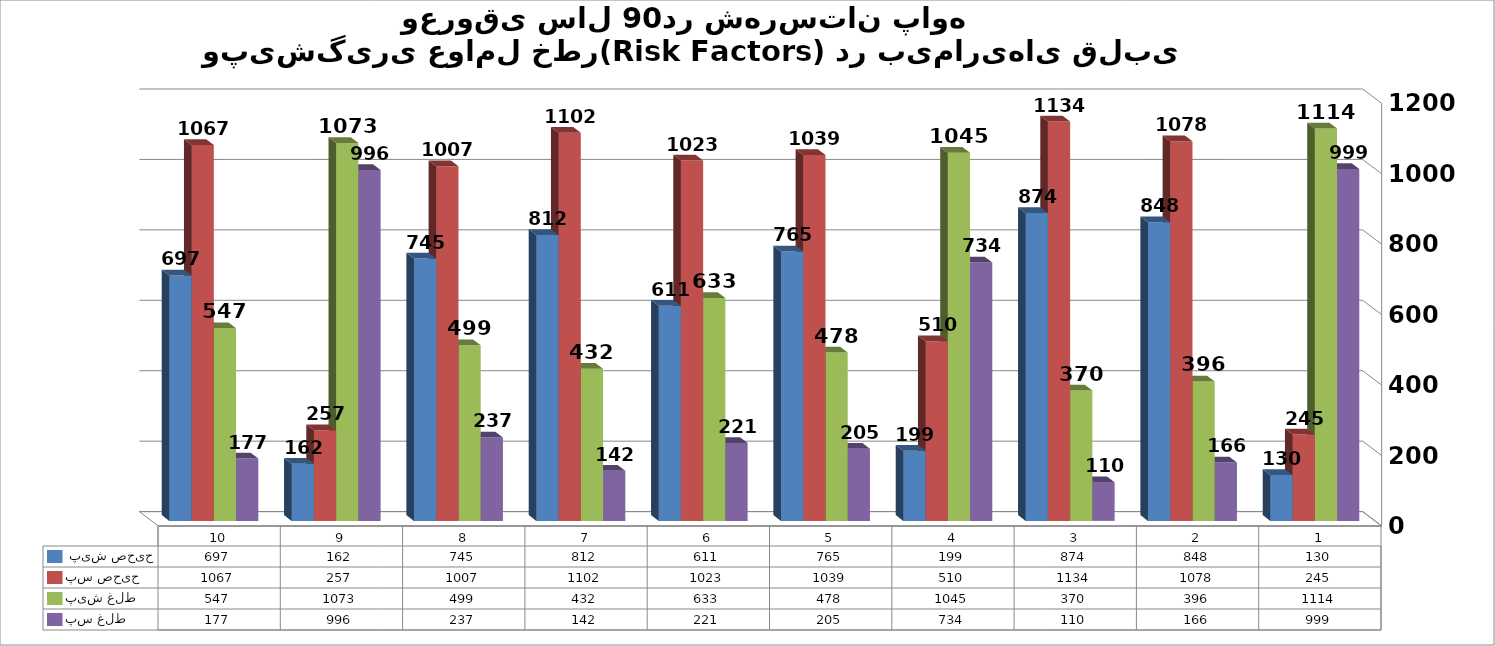
| Category |  پیش صحیح | پس صحیح | پیش غلط | پس غلط |
|---|---|---|---|---|
| 1.0 | 130 | 245 | 1114 | 999 |
| 2.0 | 848 | 1078 | 396 | 166 |
| 3.0 | 874 | 1134 | 370 | 110 |
| 4.0 | 199 | 510 | 1045 | 734 |
| 5.0 | 765 | 1039 | 478 | 205 |
| 6.0 | 611 | 1023 | 633 | 221 |
| 7.0 | 812 | 1102 | 432 | 142 |
| 8.0 | 745 | 1007 | 499 | 237 |
| 9.0 | 162 | 257 | 1073 | 996 |
| 10.0 | 697 | 1067 | 547 | 177 |